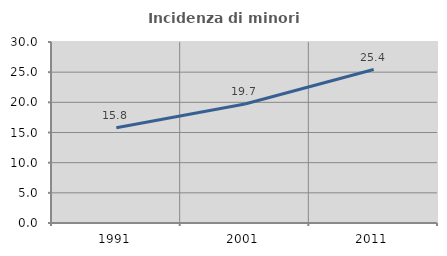
| Category | Incidenza di minori stranieri |
|---|---|
| 1991.0 | 15.789 |
| 2001.0 | 19.725 |
| 2011.0 | 25.436 |